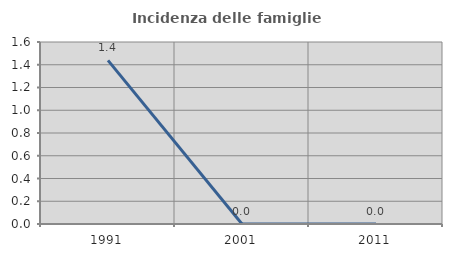
| Category | Incidenza delle famiglie numerose |
|---|---|
| 1991.0 | 1.439 |
| 2001.0 | 0 |
| 2011.0 | 0 |